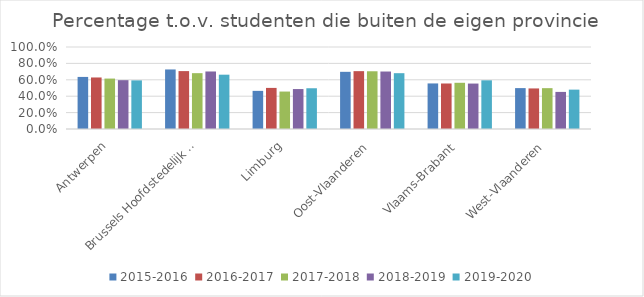
| Category | 2015-2016 | 2016-2017 | 2017-2018 | 2018-2019 | 2019-2020 |
|---|---|---|---|---|---|
| Antwerpen | 0.635 | 0.628 | 0.615 | 0.596 | 0.593 |
| Brussels Hoofdstedelijk Gewest | 0.726 | 0.706 | 0.681 | 0.701 | 0.662 |
| Limburg | 0.465 | 0.501 | 0.457 | 0.487 | 0.497 |
| Oost-Vlaanderen | 0.697 | 0.706 | 0.704 | 0.701 | 0.681 |
| Vlaams-Brabant | 0.556 | 0.555 | 0.564 | 0.554 | 0.594 |
| West-Vlaanderen | 0.499 | 0.495 | 0.498 | 0.452 | 0.48 |